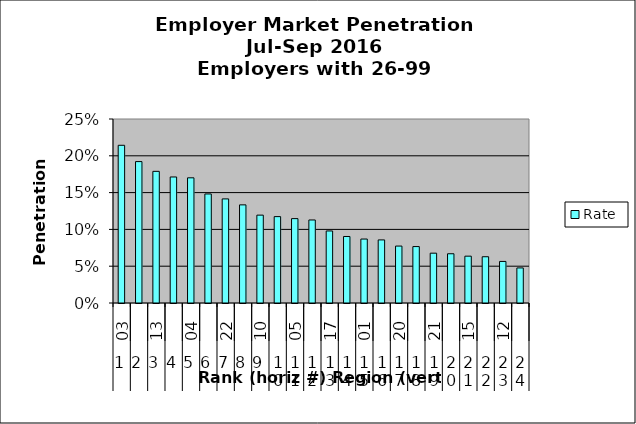
| Category | Rate |
|---|---|
| 0 | 0.214 |
| 1 | 0.192 |
| 2 | 0.179 |
| 3 | 0.171 |
| 4 | 0.17 |
| 5 | 0.148 |
| 6 | 0.141 |
| 7 | 0.133 |
| 8 | 0.119 |
| 9 | 0.117 |
| 10 | 0.115 |
| 11 | 0.113 |
| 12 | 0.098 |
| 13 | 0.09 |
| 14 | 0.087 |
| 15 | 0.086 |
| 16 | 0.077 |
| 17 | 0.077 |
| 18 | 0.068 |
| 19 | 0.067 |
| 20 | 0.064 |
| 21 | 0.063 |
| 22 | 0.056 |
| 23 | 0.048 |